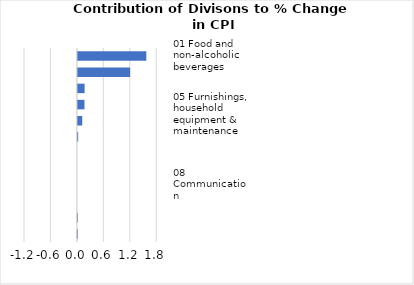
| Category |     Contributions |
|---|---|
| 01 Food and non-alcoholic beverages | 1.554 |
| 07 Transport | 1.186 |
| 04 Housing, water, electricity, gas & other fuels | 0.153 |
| 11 Restaurants and hotels | 0.149 |
| 05 Furnishings, household equipment & maintenance | 0.099 |
| 02 Alcoholic beverages, tobacco & narcotics | 0.007 |
| 09 Recreation and culture | 0 |
| 10 Education | 0 |
| 08 Communication | 0 |
| 06 Health | 0 |
| 03 Clothing and footwear | -0.001 |
| 12 Miscellaneous goods & services | -0.006 |